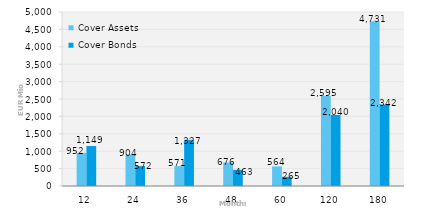
| Category | Cover Assets | Cover Bonds |
|---|---|---|
| 12.0 | 952.1 | 1149.3 |
| 24.0 | 903.9 | 571.5 |
| 36.0 | 570.8 | 1327 |
| 48.0 | 676.3 | 463 |
| 60.0 | 563.5 | 264.8 |
| 120.0 | 2594.9 | 2039.9 |
| 180.0 | 4730.9 | 2341.6 |